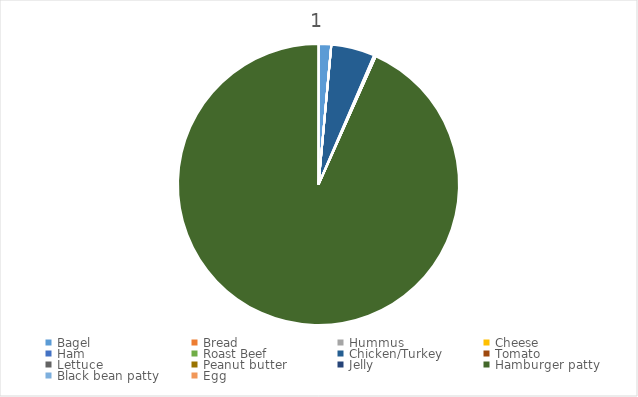
| Category | 1 |
|---|---|
| Bagel  | 41.16 |
| Bread | 0 |
| Hummus  | 0 |
| Cheese  | 0 |
| Ham  | 0 |
| Roast Beef  | 0 |
| Chicken/Turkey  | 141.68 |
| Tomato | 6 |
| Lettuce  | 0 |
| Peanut butter | 0 |
| Jelly  | 0 |
| Hamburger patty | 2645 |
| Black bean patty | 0 |
| Egg | 0 |